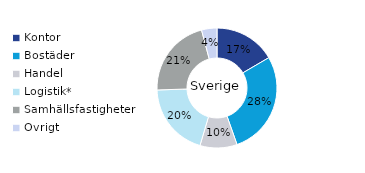
| Category | Sverige |
|---|---|
| Kontor | 0.166 |
| Bostäder | 0.28 |
| Handel | 0.1 |
| Logistik* | 0.199 |
| Samhällsfastigheter | 0.214 |
| Övrigt | 0.041 |